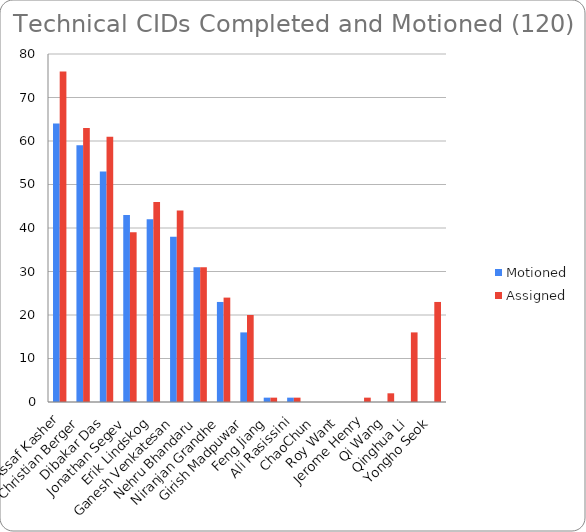
| Category | Motioned | Assigned |
|---|---|---|
| Assaf Kasher | 64 | 76 |
| Christian Berger | 59 | 63 |
| Dibakar Das | 53 | 61 |
| Jonathan Segev | 43 | 39 |
| Erik Lindskog | 42 | 46 |
| Ganesh Venkatesan | 38 | 44 |
| Nehru Bhandaru | 31 | 31 |
| Niranjan Grandhe | 23 | 24 |
| Girish Madpuwar | 16 | 20 |
| Feng Jiang | 1 | 1 |
| Ali Rasissini | 1 | 1 |
| ChaoChun | 0 | 0 |
| Roy Want | 0 | 0 |
| Jerome Henry | 0 | 1 |
| Qi Wang | 0 | 2 |
| Qinghua Li | 0 | 16 |
| Yongho Seok | 0 | 23 |